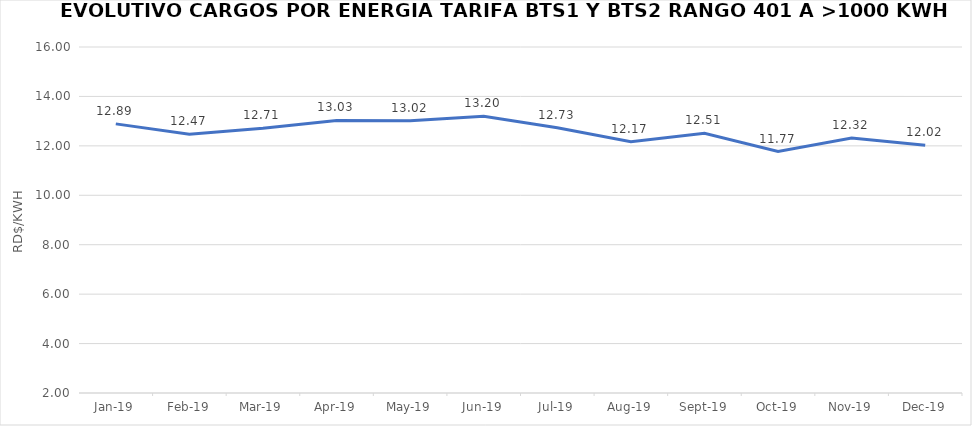
| Category | Series 0 |
|---|---|
| 2019-01-01 | 12.89 |
| 2019-02-01 | 12.47 |
| 2019-03-01 | 12.71 |
| 2019-04-01 | 13.03 |
| 2019-05-01 | 13.02 |
| 2019-06-01 | 13.2 |
| 2019-07-01 | 12.73 |
| 2019-08-01 | 12.17 |
| 2019-09-01 | 12.51 |
| 2019-10-01 | 11.77 |
| 2019-11-01 | 12.32 |
| 2019-12-01 | 12.02 |